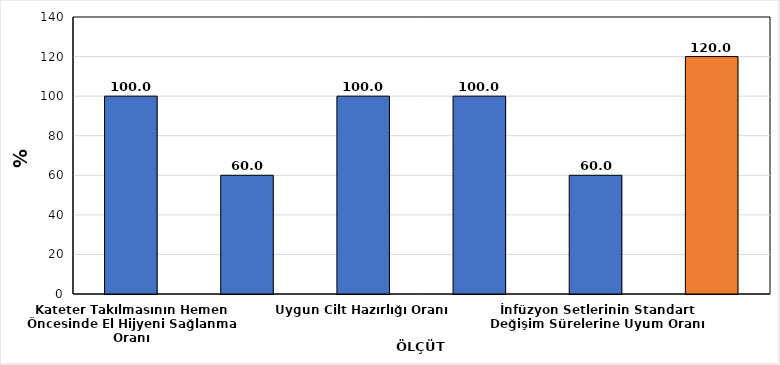
| Category | % |
|---|---|
| Kateter Takılmasının Hemen Öncesinde El Hijyeni Sağlanma Oranı | 100 |
| Uygun Alan Seçilme Oranı  | 60 |
| Uygun Cilt Hazırlığı Oranı | 100 |
| Maksimum Bariyer Önlem Oranı | 100 |
| İnfüzyon Setlerinin Standart Değişim Sürelerine Uyum Oranı | 60 |
| Uygun Pansuman Değişimi Oranı* | 120 |